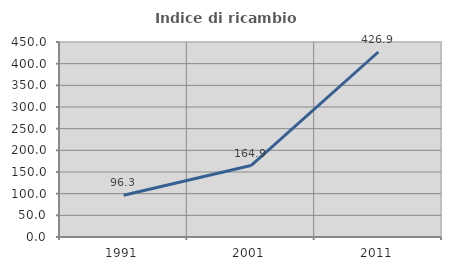
| Category | Indice di ricambio occupazionale  |
|---|---|
| 1991.0 | 96.296 |
| 2001.0 | 164.865 |
| 2011.0 | 426.923 |